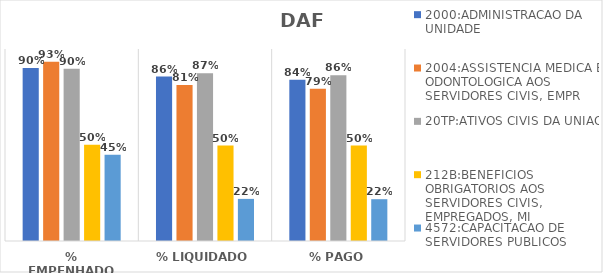
| Category | 2000:ADMINISTRACAO DA UNIDADE | 2004:ASSISTENCIA MEDICA E ODONTOLOGICA AOS SERVIDORES CIVIS, EMPR | 20TP:ATIVOS CIVIS DA UNIAO | 212B:BENEFICIOS OBRIGATORIOS AOS SERVIDORES CIVIS, EMPREGADOS, MI | 4572:CAPACITACAO DE SERVIDORES PUBLICOS FEDERAIS EM PROCESSO DE Q |
|---|---|---|---|---|---|
| % EMPENHADO | 0.902 | 0.934 | 0.898 | 0.501 | 0.449 |
| % LIQUIDADO | 0.856 | 0.813 | 0.873 | 0.497 | 0.219 |
| % PAGO | 0.84 | 0.793 | 0.863 | 0.497 | 0.218 |